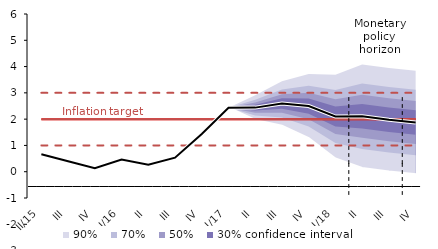
| Category | Inflation Target | Inflation Target - lower bound | Inflation Target - upper bound | linka | Střed předpovědi |
|---|---|---|---|---|---|
| II/15 | 2 | 1 | 3 | 0.667 | 0.667 |
| III | 2 | 1 | 3 | 0.4 | 0.4 |
| IV | 2 | 1 | 3 | 0.133 | 0.133 |
| I/16 | 2 | 1 | 3 | 0.467 | 0.467 |
| II | 2 | 1 | 3 | 0.267 | 0.267 |
| III | 2 | 1 | 3 | 0.533 | 0.533 |
| IV | 2 | 1 | 3 | 1.433 | 1.433 |
| I/17 | 2 | 1 | 3 | 2.433 | 2.433 |
| II | 2 | 1 | 3 | 2.438 | 2.438 |
| III | 2 | 1 | 3 | 2.596 | 2.596 |
| IV | 2 | 1 | 3 | 2.498 | 2.498 |
| I/18 | 2 | 1 | 3 | 2.099 | 2.099 |
| II | 2 | 1 | 3 | 2.109 | 2.109 |
| III | 2 | 1 | 3 | 1.978 | 1.978 |
| IV | 2 | 1 | 3 | 1.871 | 1.871 |